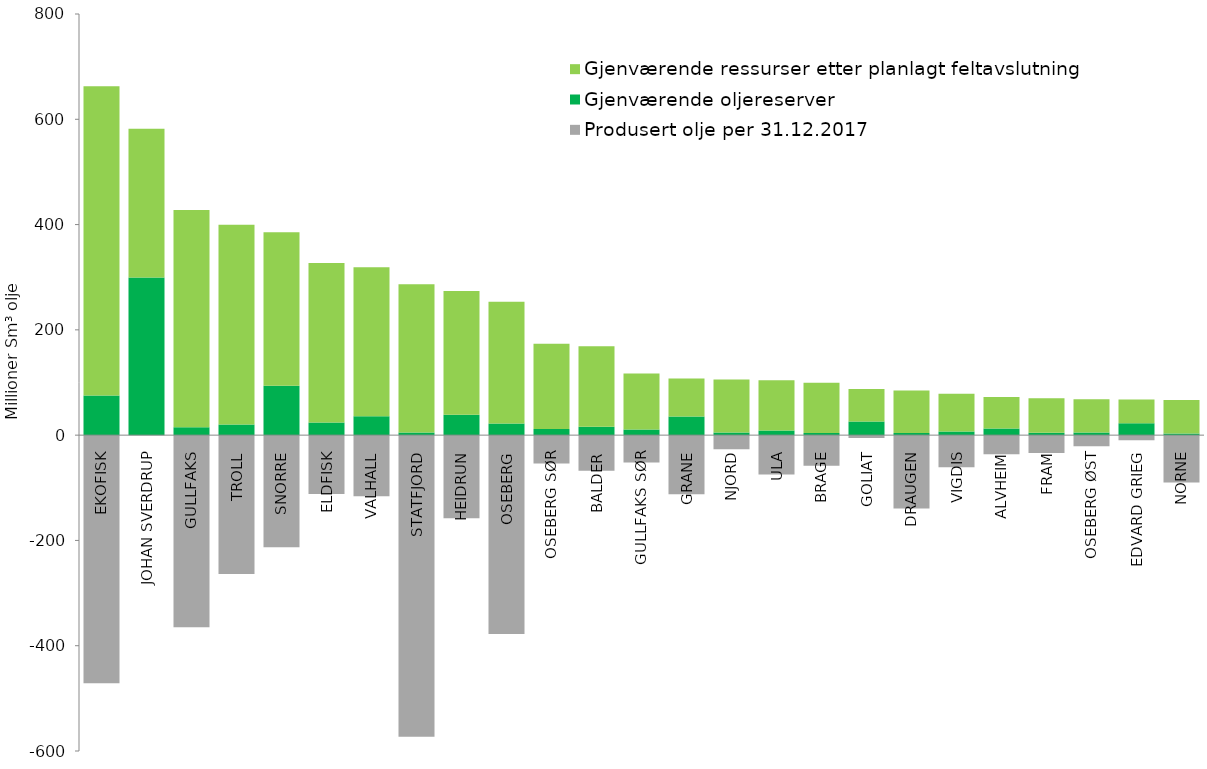
| Category | Produsert olje per 31.12.2017 | Gjenværende oljereserver | Gjenværende ressurser etter planlagt feltavslutning |
|---|---|---|---|
| EKOFISK | -471.5 | 75.28 | 587.41 |
| JOHAN SVERDRUP | 0 | 299.67 | 282.33 |
| GULLFAKS | -365.01 | 14.76 | 412.83 |
| TROLL | -263.75 | 20.17 | 379.57 |
| SNORRE | -212.81 | 93.84 | 291.34 |
| ELDFISK | -111.78 | 24.18 | 302.85 |
| VALHALL | -116.07 | 35.87 | 283.28 |
| STATFJORD | -573.14 | 4.83 | 281.85 |
| HEIDRUN | -158.01 | 38.54 | 235.45 |
| OSEBERG | -377.63 | 22.19 | 231.32 |
| OSEBERG SØR | -54.06 | 11.82 | 161.92 |
| BALDER | -67.64 | 15.74 | 153.15 |
| GULLFAKS SØR | -51.77 | 10.57 | 106.54 |
| GRANE | -112.48 | 35.46 | 72.06 |
| NJORD | -26.66 | 4.83 | 100.7 |
| ULA | -74.84 | 8.59 | 95.91 |
| BRAGE | -58.25 | 4.25 | 95.3 |
| GOLIAT | -5.49 | 26.08 | 61.51 |
| DRAUGEN | -139.54 | 3.84 | 81.01 |
| VIGDIS | -60.78 | 6.77 | 71.85 |
| ALVHEIM | -36.47 | 12.7 | 59.76 |
| FRAM | -33.85 | 4.59 | 65.55 |
| OSEBERG ØST | -21.15 | 4.87 | 63.18 |
| EDVARD GRIEG | -9.47 | 22.55 | 45.09 |
| NORNE | -90.1 | 2.99 | 63.91 |